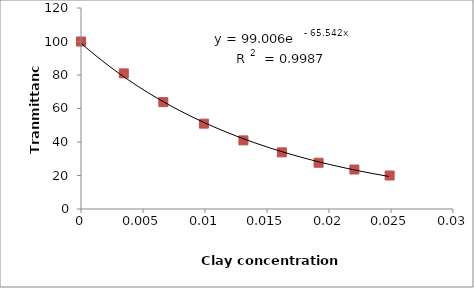
| Category | Series 1 |
|---|---|
| 0.0 | 100 |
| 0.0034516765285996 | 80.952 |
| 0.00664024475038242 | 63.81 |
| 0.00991219646041981 | 50.952 |
| 0.0130973331528361 | 40.952 |
| 0.0161990647962592 | 33.81 |
| 0.0191597414589104 | 27.619 |
| 0.0220463722808389 | 23.571 |
| 0.0248906611782866 | 20 |